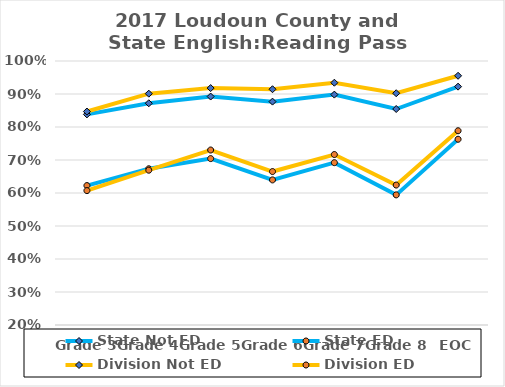
| Category | State Not ED | State ED | Division Not ED | Division ED |
|---|---|---|---|---|
| Grade 3 | 0.838 | 0.622 | 0.847 | 0.607 |
| Grade 4 | 0.872 | 0.673 | 0.901 | 0.669 |
| Grade 5 | 0.892 | 0.704 | 0.918 | 0.73 |
| Grade 6 | 0.877 | 0.64 | 0.914 | 0.665 |
| Grade 7 | 0.898 | 0.692 | 0.934 | 0.717 |
| Grade 8 | 0.854 | 0.594 | 0.902 | 0.624 |
| EOC | 0.922 | 0.763 | 0.955 | 0.789 |